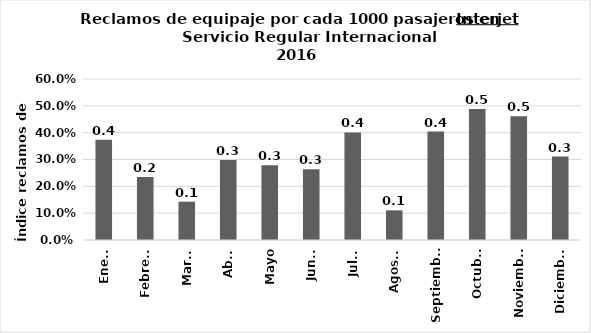
| Category | Reclamos por cada 1000 pasajeros |
|---|---|
| Enero | 0.374 |
| Febrero | 0.234 |
| Marzo | 0.143 |
| Abril | 0.299 |
| Mayo | 0.279 |
| Junio | 0.264 |
| Julio | 0.401 |
| Agosto | 0.111 |
| Septiembre | 0.404 |
| Octubre | 0.488 |
| Noviembre | 0.461 |
| Diciembre | 0.311 |